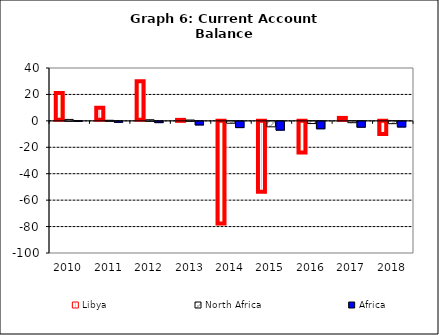
| Category | Libya | North Africa | Africa |
|---|---|---|---|
| 2010.0 | 21.136 | 1.095 | 0.144 |
| 2011.0 | 9.916 | 0.439 | -0.706 |
| 2012.0 | 29.886 | 0.839 | -0.95 |
| 2013.0 | 0.019 | 0.638 | -2.715 |
| 2014.0 | -78.446 | -1.429 | -4.722 |
| 2015.0 | -54.355 | -4.138 | -6.65 |
| 2016.0 | -24.677 | -1.65 | -5.608 |
| 2017.0 | 2.237 | -1.011 | -4.418 |
| 2018.0 | -10.722 | -1.744 | -4.278 |